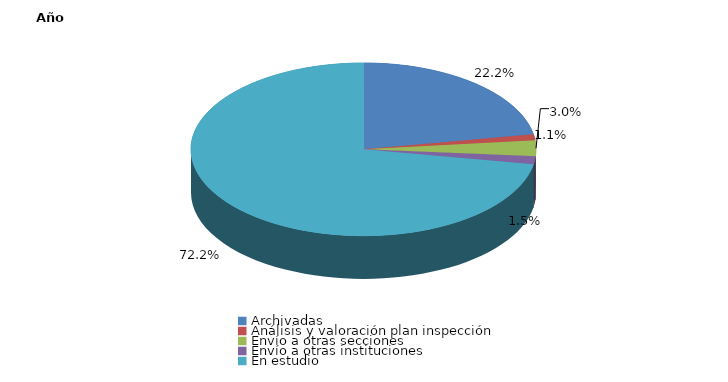
| Category | Series 0 |
|---|---|
| Archivadas | 60 |
| Análisis y valoración plan inspección | 3 |
| Envío a otras secciones | 8 |
| Envío a otras instituciones | 4 |
| En estudio | 195 |